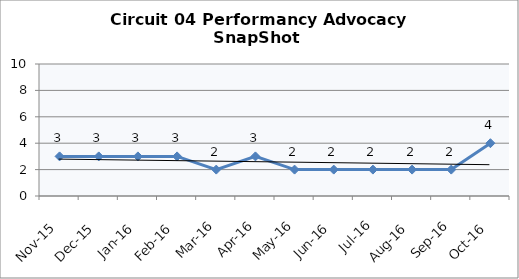
| Category | Circuit 04 |
|---|---|
| Nov-15 | 3 |
| Dec-15 | 3 |
| Jan-16 | 3 |
| Feb-16 | 3 |
| Mar-16 | 2 |
| Apr-16 | 3 |
| May-16 | 2 |
| Jun-16 | 2 |
| Jul-16 | 2 |
| Aug-16 | 2 |
| Sep-16 | 2 |
| Oct-16 | 4 |